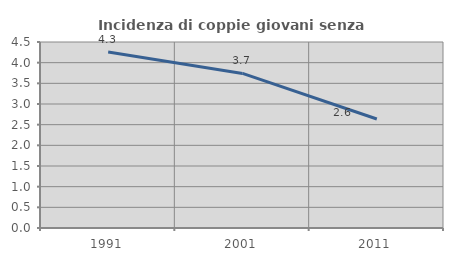
| Category | Incidenza di coppie giovani senza figli |
|---|---|
| 1991.0 | 4.256 |
| 2001.0 | 3.74 |
| 2011.0 | 2.637 |